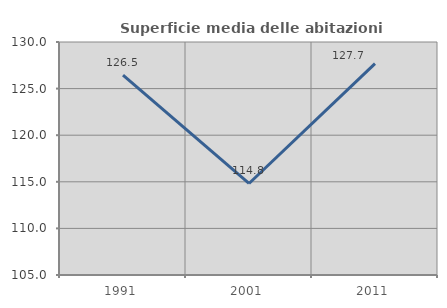
| Category | Superficie media delle abitazioni occupate |
|---|---|
| 1991.0 | 126.455 |
| 2001.0 | 114.821 |
| 2011.0 | 127.687 |